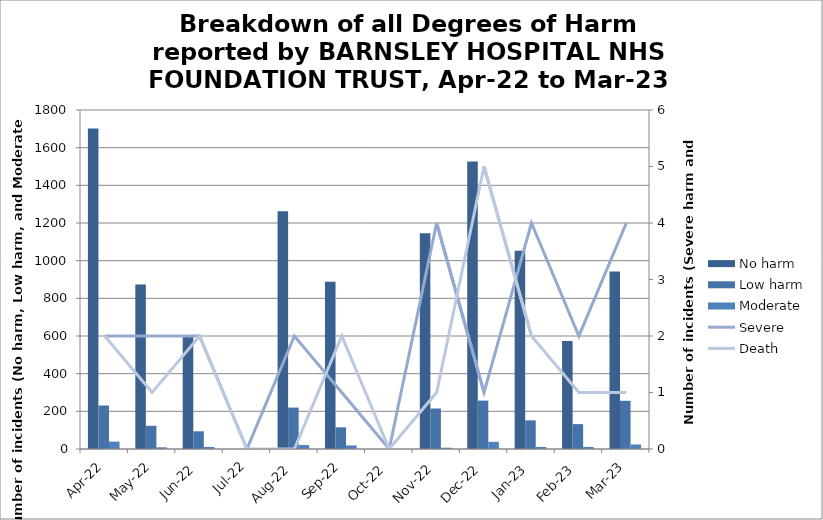
| Category | No harm | Low harm | Moderate |
|---|---|---|---|
| Apr-22 | 1702 | 231 | 39 |
| May-22 | 873 | 123 | 9 |
| Jun-22 | 601 | 94 | 11 |
| Jul-22 | 0 | 0 | 0 |
| Aug-22 | 1263 | 220 | 21 |
| Sep-22 | 888 | 115 | 19 |
| Oct-22 | 0 | 0 | 0 |
| Nov-22 | 1145 | 215 | 7 |
| Dec-22 | 1527 | 257 | 38 |
| Jan-23 | 1052 | 152 | 11 |
| Feb-23 | 574 | 132 | 11 |
| Mar-23 | 943 | 256 | 24 |